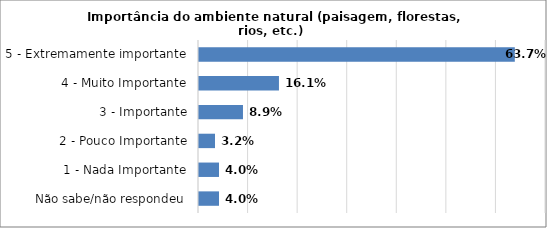
| Category | Series 0 |
|---|---|
| Não sabe/não respondeu | 0.04 |
| 1 - Nada Importante | 0.04 |
| 2 - Pouco Importante | 0.032 |
| 3 - Importante | 0.089 |
| 4 - Muito Importante | 0.161 |
| 5 - Extremamente importante | 0.637 |